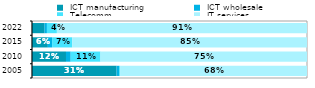
| Category |  ICT manufacturing |  ICT wholesale |  Telecomm. |  IT services |
|---|---|---|---|---|
| 2005.0 | 0.308 | 0.009 | 0.003 | 0.68 |
| 2010.0 | 0.124 | 0.017 | 0.108 | 0.751 |
| 2015.0 | 0.058 | 0.015 | 0.073 | 0.854 |
| 2022.0 | 0.046 | 0.009 | 0.036 | 0.909 |